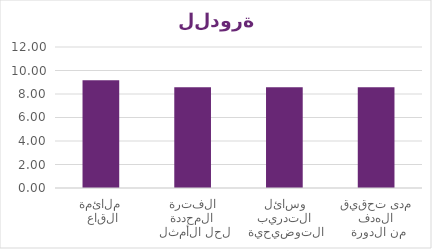
| Category | Series 0 |
|---|---|
|  ملائمة القاعة | 9.167 |
|  الفترة المحددة لحل الأمثلة | 8.583 |
|  وسائل التدريب التوضيحية | 8.583 |
|  مدى تحقيق الهدف من الدورة | 8.583 |